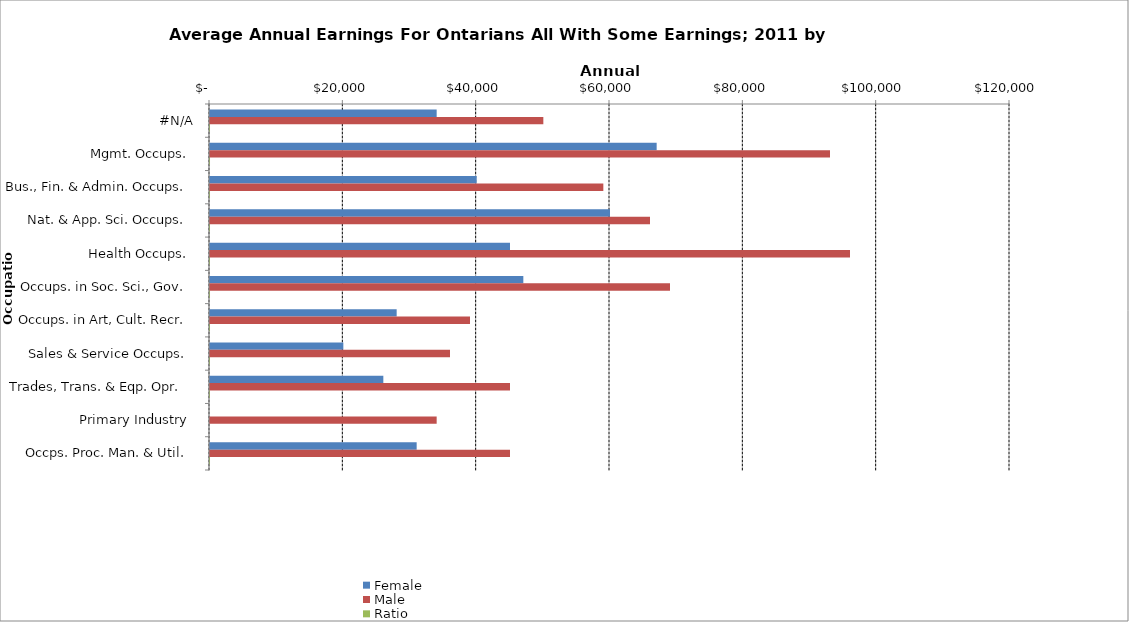
| Category | Female | Male | Ratio |
|---|---|---|---|
|  #N/A  | 34000 | 50000 | 0.68 |
|  Mgmt. Occups.  | 67000 | 93000 | 0.72 |
|  Bus., Fin. & Admin. Occups.  | 40000 | 59000 | 0.678 |
|  Nat. & App. Sci. Occups.  | 60000 | 66000 | 0.909 |
|  Health Occups.  | 45000 | 96000 | 0.469 |
|  Occups. in Soc. Sci., Gov.  | 47000 | 69000 | 0.681 |
|  Occups. in Art, Cult. Recr.  | 28000 | 39000 | 0.718 |
|  Sales & Service Occups.  | 20000 | 36000 | 0.556 |
|  Trades, Trans. & Eqp. Opr.   | 26000 | 45000 | 0.578 |
|  Primary Industry  | 0 | 34000 | 0 |
|  Occps. Proc. Man. & Util.  | 31000 | 45000 | 0.689 |